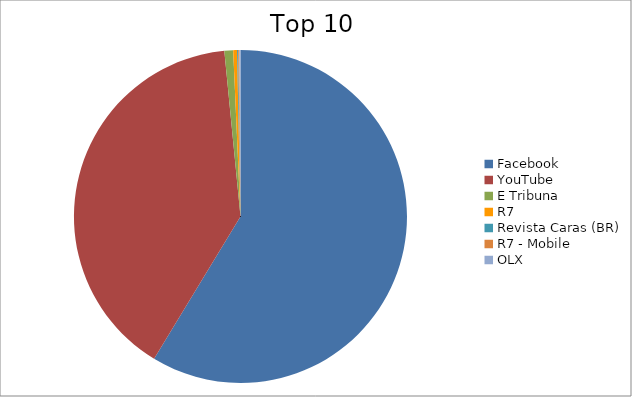
| Category | Series 0 |
|---|---|
| Facebook | 58.69 |
| YouTube | 39.77 |
| E Tribuna | 0.85 |
| R7 | 0.37 |
| Revista Caras (BR) | 0.11 |
| R7 - Mobile | 0.11 |
| OLX | 0.11 |